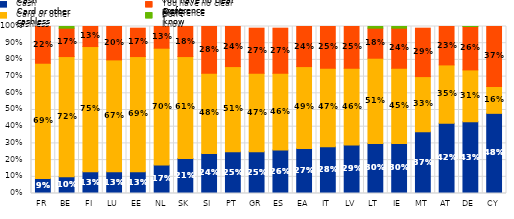
| Category | Cash | Card or other cashless | You have no clear preference | Don't know |
|---|---|---|---|---|
| FR | 0.09 | 0.69 | 0.22 | 0 |
| BE | 0.1 | 0.72 | 0.17 | 0.01 |
| FI | 0.13 | 0.75 | 0.13 | 0 |
| LU | 0.13 | 0.67 | 0.2 | 0 |
| EE | 0.13 | 0.69 | 0.17 | 0 |
| NL | 0.17 | 0.7 | 0.13 | 0 |
| SK | 0.21 | 0.61 | 0.18 | 0 |
| SI | 0.24 | 0.48 | 0.28 | 0 |
| PT | 0.25 | 0.51 | 0.24 | 0 |
| GR | 0.25 | 0.47 | 0.27 | 0 |
| ES | 0.26 | 0.46 | 0.27 | 0 |
| EA | 0.27 | 0.49 | 0.24 | 0 |
| IT | 0.28 | 0.47 | 0.25 | 0 |
| LV | 0.29 | 0.46 | 0.25 | 0 |
| LT | 0.3 | 0.51 | 0.18 | 0.01 |
| IE | 0.3 | 0.45 | 0.24 | 0.01 |
| MT | 0.37 | 0.33 | 0.29 | 0 |
| AT | 0.42 | 0.35 | 0.23 | 0 |
| DE | 0.43 | 0.31 | 0.26 | 0.01 |
| CY | 0.48 | 0.16 | 0.37 | 0 |